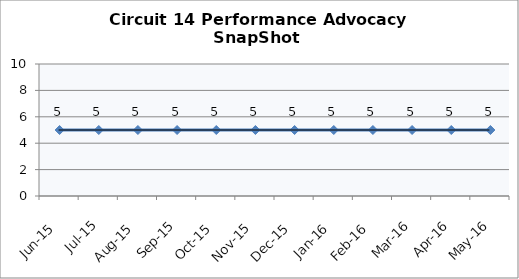
| Category | Circuit 14 |
|---|---|
| Jun-15 | 5 |
| Jul-15 | 5 |
| Aug-15 | 5 |
| Sep-15 | 5 |
| Oct-15 | 5 |
| Nov-15 | 5 |
| Dec-15 | 5 |
| Jan-16 | 5 |
| Feb-16 | 5 |
| Mar-16 | 5 |
| Apr-16 | 5 |
| May-16 | 5 |